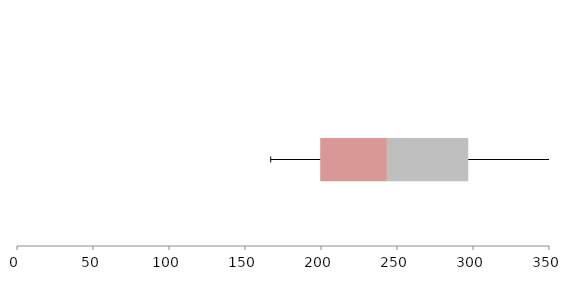
| Category | Series 1 | Series 2 | Series 3 |
|---|---|---|---|
| 0 | 199.49 | 43.856 | 53.541 |